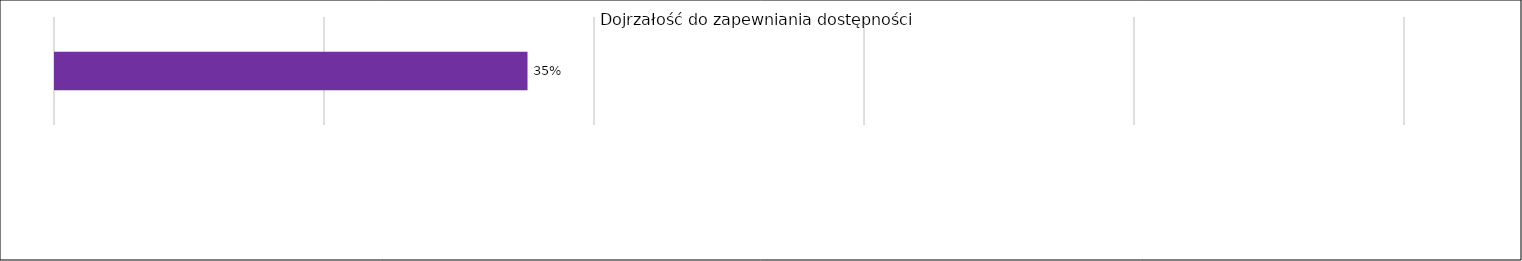
| Category | Ogółem punktów |
|---|---|
| 0 | 0.35 |